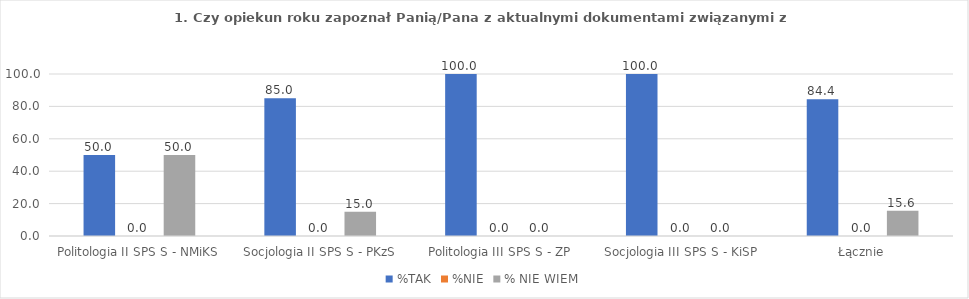
| Category | %TAK | %NIE | % NIE WIEM |
|---|---|---|---|
| Politologia II SPS S - NMiKS | 50 | 0 | 50 |
| Socjologia II SPS S - PKzS | 85 | 0 | 15 |
| Politologia III SPS S - ZP | 100 | 0 | 0 |
| Socjologia III SPS S - KiSP | 100 | 0 | 0 |
| Łącznie | 84.375 | 0 | 15.625 |